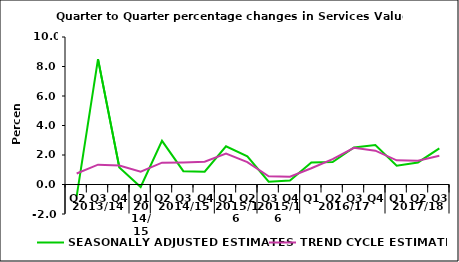
| Category | SEASONALLY ADJUSTED ESTIMATES | TREND CYCLE ESTIMATES |
|---|---|---|
| 0 | -0.81 | 0.747 |
| 1 | 8.5 | 1.342 |
| 2 | 1.161 | 1.285 |
| 3 | -0.172 | 0.875 |
| 4 | 2.961 | 1.482 |
| 5 | 0.902 | 1.5 |
| 6 | 0.873 | 1.547 |
| 7 | 2.59 | 2.091 |
| 8 | 1.914 | 1.522 |
| 9 | 0.192 | 0.553 |
| 10 | 0.274 | 0.527 |
| 11 | 1.499 | 1.1 |
| 12 | 1.519 | 1.716 |
| 13 | 2.512 | 2.489 |
| 14 | 2.674 | 2.295 |
| 15 | 1.28 | 1.639 |
| 16 | 1.496 | 1.616 |
| 17 | 2.447 | 1.953 |